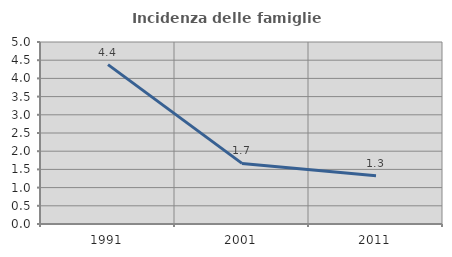
| Category | Incidenza delle famiglie numerose |
|---|---|
| 1991.0 | 4.379 |
| 2001.0 | 1.665 |
| 2011.0 | 1.323 |